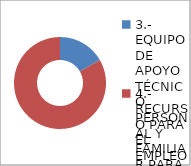
| Category | Series 0 |
|---|---|
| 3.- EQUIPO DE APOYO TÉCNICO PERSONAL Y FAMILIAR PARA LA INCLUSIÓN SOCIAL | 1 |
| 4.- RECURSO PARA EL EMPLEO | 5 |